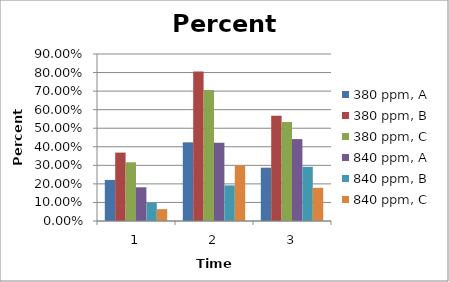
| Category | 380 ppm, A | 380 ppm, B | 380 ppm, C | 840 ppm, A | 840 ppm, B | 840 ppm, C |
|---|---|---|---|---|---|---|
| 0 | 0.221 | 0.369 | 0.316 | 0.182 | 0.098 | 0.064 |
| 1 | 0.424 | 0.805 | 0.706 | 0.422 | 0.192 | 0.298 |
| 2 | 0.287 | 0.567 | 0.534 | 0.441 | 0.292 | 0.179 |